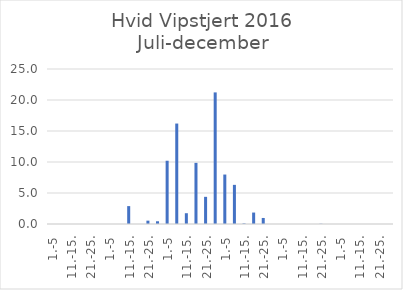
| Category | Series 0 |
|---|---|
| 1.-5 | 0 |
| 6.-10. | 0 |
| 11.-15. | 0 |
| 16.-20. | 0 |
| 21.-25. | 0 |
| 26.-31. | 0 |
| 1.-5 | 0 |
| 6.-10. | 0 |
| 11.-15. | 2.886 |
| 16.-20. | 0 |
| 21.-25. | 0.539 |
| 26.-31. | 0.442 |
| 1.-5 | 10.202 |
| 6.-10. | 16.203 |
| 11.-15. | 1.739 |
| 16.-20. | 9.86 |
| 21.-25. | 4.382 |
| 26.-30. | 21.225 |
| 1.-5 | 7.978 |
| 6.-10. | 6.313 |
| 11.-15. | 0.094 |
| 16.-20. | 1.846 |
| 21.-25. | 0.974 |
| 26.-31. | 0 |
| 1.-5 | 0 |
| 6.-10. | 0 |
| 11.-15. | 0 |
| 16.-20. | 0 |
| 21.-25. | 0.037 |
| 26.-30. | 0 |
| 1.-5 | 0 |
| 6.-10. | 0 |
| 11.-15. | 0 |
| 16.-20. | 0 |
| 21.-25. | 0 |
| 26.-31. | 0 |